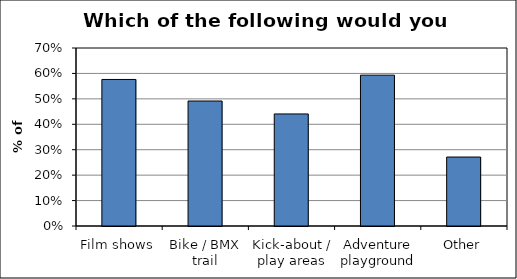
| Category | Series 0 |
|---|---|
| Film shows | 0.576 |
| Bike / BMX trail | 0.492 |
| Kick-about / play areas | 0.441 |
| Adventure playground | 0.593 |
| Other | 0.271 |